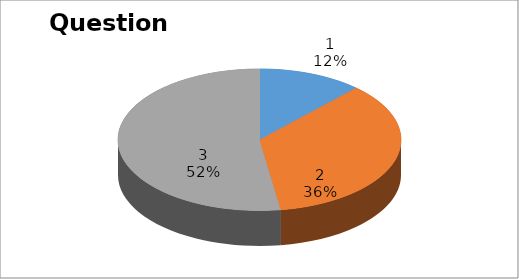
| Category | Series 0 |
|---|---|
| 0 | 5 |
| 1 | 15 |
| 2 | 22 |